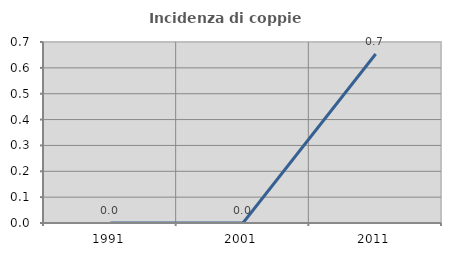
| Category | Incidenza di coppie miste |
|---|---|
| 1991.0 | 0 |
| 2001.0 | 0 |
| 2011.0 | 0.654 |